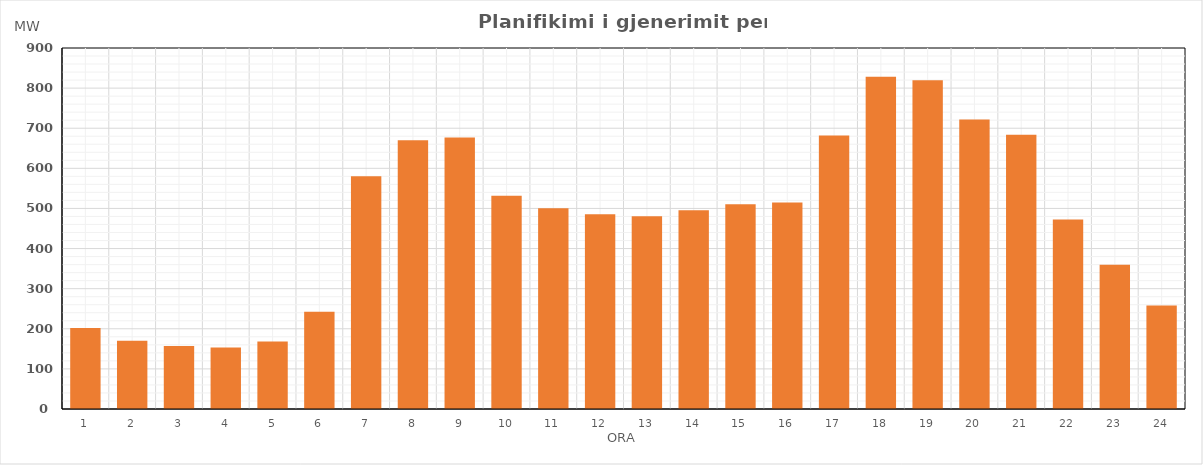
| Category | Max (MW) |
|---|---|
| 0 | 201.89 |
| 1 | 170.15 |
| 2 | 157.21 |
| 3 | 153.28 |
| 4 | 168.17 |
| 5 | 242.14 |
| 6 | 580.18 |
| 7 | 670.022 |
| 8 | 677.034 |
| 9 | 531.846 |
| 10 | 500.649 |
| 11 | 485.539 |
| 12 | 480.556 |
| 13 | 495.555 |
| 14 | 510.641 |
| 15 | 514.714 |
| 16 | 681.773 |
| 17 | 828.509 |
| 18 | 819.622 |
| 19 | 721.5 |
| 20 | 684.028 |
| 21 | 472.518 |
| 22 | 359.81 |
| 23 | 258.25 |